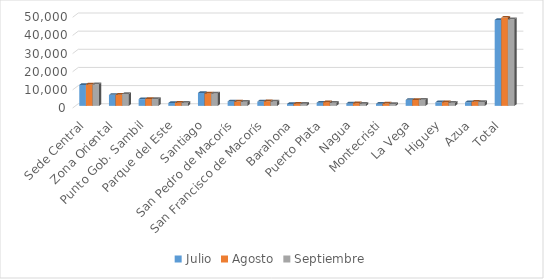
| Category | Julio | Agosto | Septiembre |
|---|---|---|---|
| Sede Central | 11533 | 11828 | 11878 |
| Zona Oriental | 6050 | 6114 | 6534 |
| Punto Gob. Sambil | 3724 | 3810 | 3794 |
| Parque del Este | 1586 | 1678 | 1686 |
| Santiago | 7114 | 6865 | 6855 |
| San Pedro de Macorís | 2452 | 2358 | 2234 |
| San Francisco de Macorís | 2363 | 2531 | 2397 |
| Barahona | 1048 | 1174 | 1213 |
| Puerto Plata | 1737 | 2041 | 1684 |
| Nagua | 1345 | 1446 | 1207 |
| Montecristi | 1157 | 1276 | 1001 |
| La Vega | 3308 | 3284 | 3336 |
| Higuey | 1948 | 2020 | 1771 |
| Azua | 1975 | 2217 | 2118 |
| Total | 47340 | 48642 | 47708 |